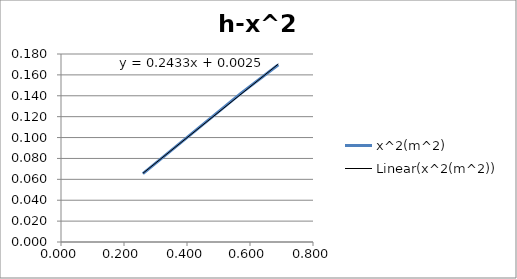
| Category | x^2(m^2) |
|---|---|
| 0.26 | 0.066 |
| 0.57 | 0.142 |
| 0.69 | 0.17 |